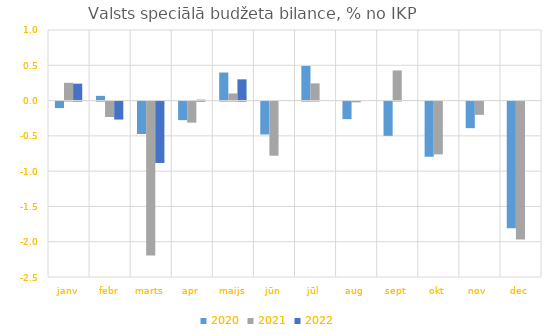
| Category | 2020 | 2021 | 2022 |
|---|---|---|---|
| janv | -0.092 | 0.251 | 0.24 |
| febr | 0.067 | -0.218 | -0.255 |
| marts | -0.46 | -2.183 | -0.87 |
| apr | -0.263 | -0.299 | 0.012 |
| maijs | 0.397 | 0.101 | 0.301 |
| jūn | -0.466 | -0.767 | 0 |
| jūl | 0.49 | 0.243 | 0 |
| aug | -0.249 | -0.012 | 0 |
| sept | -0.485 | 0.427 | 0 |
| okt | -0.782 | -0.749 | 0 |
| nov | -0.377 | -0.188 | 0 |
| dec | -1.793 | -1.955 | 0 |